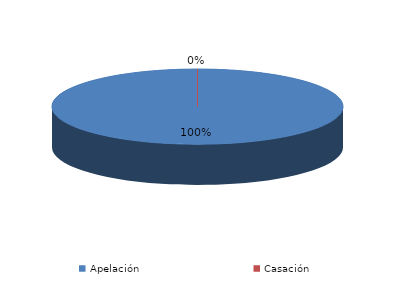
| Category | Series 0 |
|---|---|
| Apelación | 13 |
| Casación | 0 |